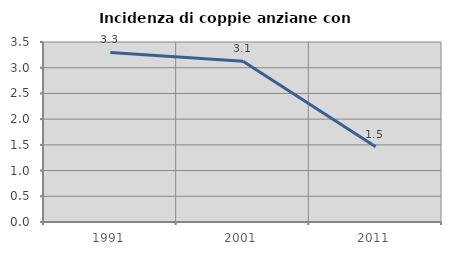
| Category | Incidenza di coppie anziane con figli |
|---|---|
| 1991.0 | 3.297 |
| 2001.0 | 3.125 |
| 2011.0 | 1.463 |